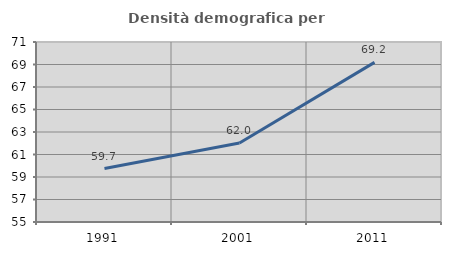
| Category | Densità demografica |
|---|---|
| 1991.0 | 59.748 |
| 2001.0 | 62.025 |
| 2011.0 | 69.191 |